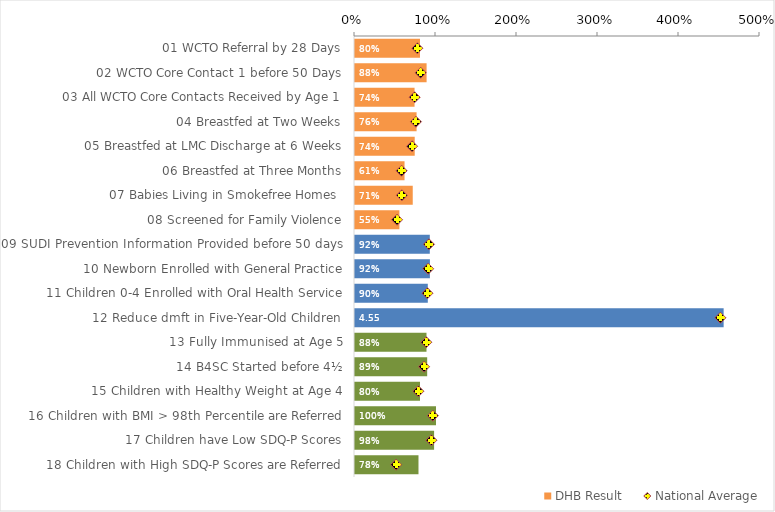
| Category | DHB Result |
|---|---|
| 01 WCTO Referral by 28 Days | 0.802 |
| 02 WCTO Core Contact 1 before 50 Days | 0.884 |
| 03 All WCTO Core Contacts Received by Age 1 | 0.735 |
| 04 Breastfed at Two Weeks | 0.76 |
| 05 Breastfed at LMC Discharge at 6 Weeks | 0.737 |
| 06 Breastfed at Three Months | 0.612 |
| 07 Babies Living in Smokefree Homes  | 0.713 |
| 08 Screened for Family Violence | 0.548 |
| 09 SUDI Prevention Information Provided before 50 days | 0.923 |
| 10 Newborn Enrolled with General Practice | 0.925 |
| 11 Children 0-4 Enrolled with Oral Health Service | 0.899 |
| 12 Reduce dmft in Five-Year-Old Children | 4.551 |
| 13 Fully Immunised at Age 5 | 0.883 |
| 14 B4SC Started before 4½ | 0.891 |
| 15 Children with Healthy Weight at Age 4 | 0.802 |
| 16 Children with BMI > 98th Percentile are Referred | 1 |
| 17 Children have Low SDQ-P Scores | 0.976 |
| 18 Children with High SDQ-P Scores are Referred | 0.784 |